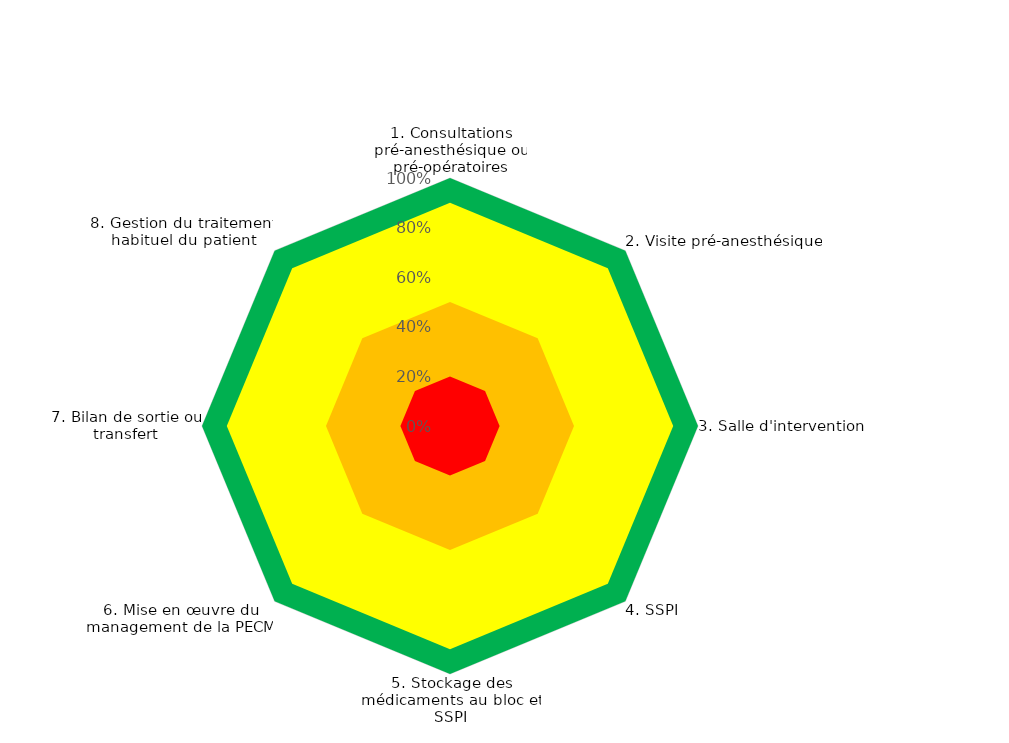
| Category | Series 1 | Zone 3 | Zone 2 | Zone 1 | Niveau de conformité |
|---|---|---|---|---|---|
| 1. Consultations pré-anesthésique ou pré-opératoires | 1 | 0.9 | 0.5 | 0.2 | 0 |
| 2. Visite pré-anesthésique | 1 | 0.9 | 0.5 | 0.2 | 0 |
| 3. Salle d'intervention | 1 | 0.9 | 0.5 | 0.2 | 0 |
| 4. SSPI | 1 | 0.9 | 0.5 | 0.2 | 0 |
| 5. Stockage des médicaments au bloc et SSPI | 1 | 0.9 | 0.5 | 0.2 | 0 |
| 6. Mise en œuvre du management de la PECM | 1 | 0.9 | 0.5 | 0.2 | 0 |
| 7. Bilan de sortie ou transfert | 1 | 0.9 | 0.5 | 0.2 | 0 |
| 8. Gestion du traitement habituel du patient | 1 | 0.9 | 0.5 | 0.2 | 0 |